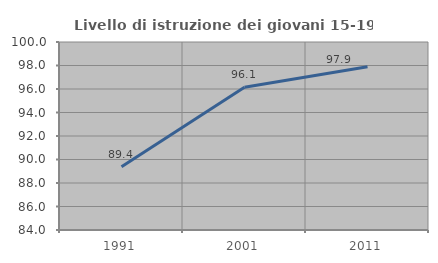
| Category | Livello di istruzione dei giovani 15-19 anni |
|---|---|
| 1991.0 | 89.383 |
| 2001.0 | 96.145 |
| 2011.0 | 97.902 |